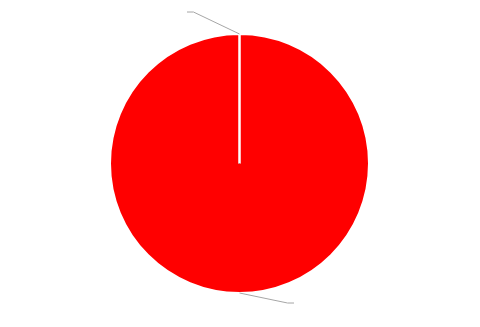
| Category | Fiscalizações |
|---|---|
| 0 | 0 |
| 1 | 31 |